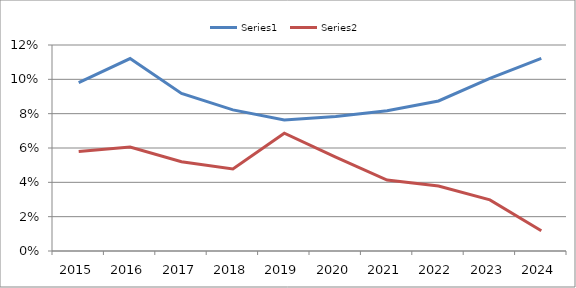
| Category | Series 0 | Series 1 |
|---|---|---|
| 2015.0 | 0.098 | 0.058 |
| 2016.0 | 0.112 | 0.061 |
| 2017.0 | 0.092 | 0.052 |
| 2018.0 | 0.082 | 0.048 |
| 2019.0 | 0.076 | 0.069 |
| 2020.0 | 0.078 | 0.055 |
| 2021.0 | 0.082 | 0.041 |
| 2022.0 | 0.087 | 0.038 |
| 2023.0 | 0.1 | 0.03 |
| 2024.0 | 0.112 | 0.012 |